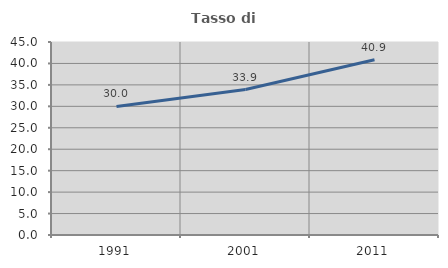
| Category | Tasso di occupazione   |
|---|---|
| 1991.0 | 29.97 |
| 2001.0 | 33.915 |
| 2011.0 | 40.863 |